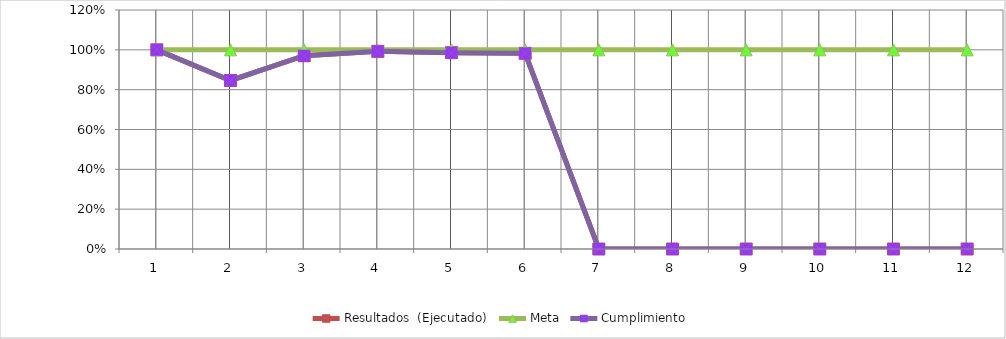
| Category | Resultados  (Ejecutado) | Meta | Cumplimiento |
|---|---|---|---|
| 0 | 1 | 1 | 1 |
| 1 | 0.846 | 1 | 0.846 |
| 2 | 0.97 | 1 | 0.97 |
| 3 | 0.992 | 1 | 0.992 |
| 4 | 0.986 | 1 | 0.986 |
| 5 | 0.983 | 1 | 0.983 |
| 6 | 0 | 1 | 0 |
| 7 | 0 | 1 | 0 |
| 8 | 0 | 1 | 0 |
| 9 | 0 | 1 | 0 |
| 10 | 0 | 1 | 0 |
| 11 | 0 | 1 | 0 |